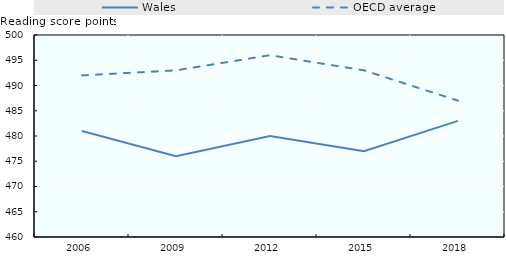
| Category | Wales | OECD average |
|---|---|---|
| 2006.0 | 481 | 492 |
| 2009.0 | 476 | 493 |
| 2012.0 | 480 | 496 |
| 2015.0 | 477 | 493 |
| 2018.0 | 483 | 487 |